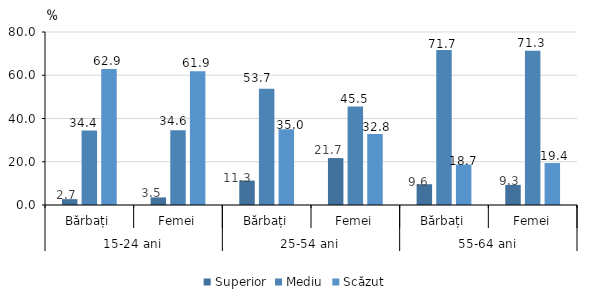
| Category | Superior | Mediu | Scăzut |
|---|---|---|---|
| 0 | 2.7 | 34.4 | 62.9 |
| 1 | 3.5 | 34.6 | 61.9 |
| 2 | 11.3 | 53.7 | 35 |
| 3 | 21.7 | 45.5 | 32.8 |
| 4 | 9.6 | 71.7 | 18.7 |
| 5 | 9.3 | 71.3 | 19.4 |